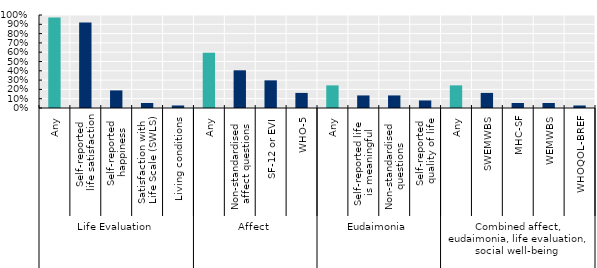
| Category | Series 0 |
|---|---|
| 0 | 0.973 |
| 1 | 0.919 |
| 2 | 0.189 |
| 3 | 0.054 |
| 4 | 0.027 |
| 5 | 0.595 |
| 6 | 0.405 |
| 7 | 0.297 |
| 8 | 0.162 |
| 9 | 0.243 |
| 10 | 0.135 |
| 11 | 0.135 |
| 12 | 0.081 |
| 13 | 0.243 |
| 14 | 0.162 |
| 15 | 0.054 |
| 16 | 0.054 |
| 17 | 0.027 |